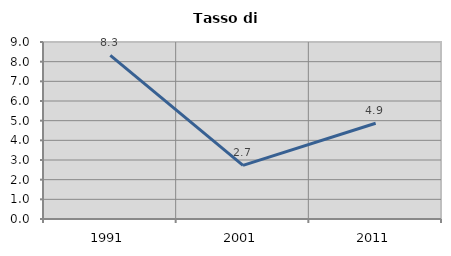
| Category | Tasso di disoccupazione   |
|---|---|
| 1991.0 | 8.32 |
| 2001.0 | 2.727 |
| 2011.0 | 4.867 |